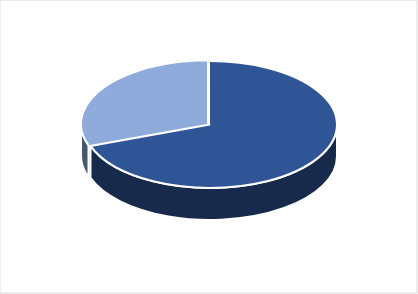
| Category | Series 0 |
|---|---|
| PRESUPUESTO VIGENTE PARA 2023 | 26648782 |
| PRESUPUESTO EJECUTADO  | 11676690.45 |
| PORCENTAJE DE EJECUCIÓN  | 0.438 |